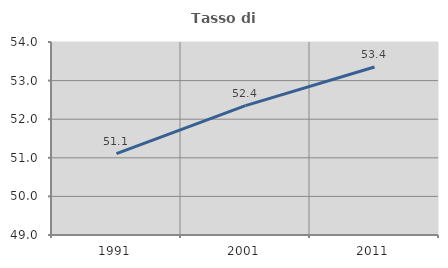
| Category | Tasso di occupazione   |
|---|---|
| 1991.0 | 51.109 |
| 2001.0 | 52.351 |
| 2011.0 | 53.352 |